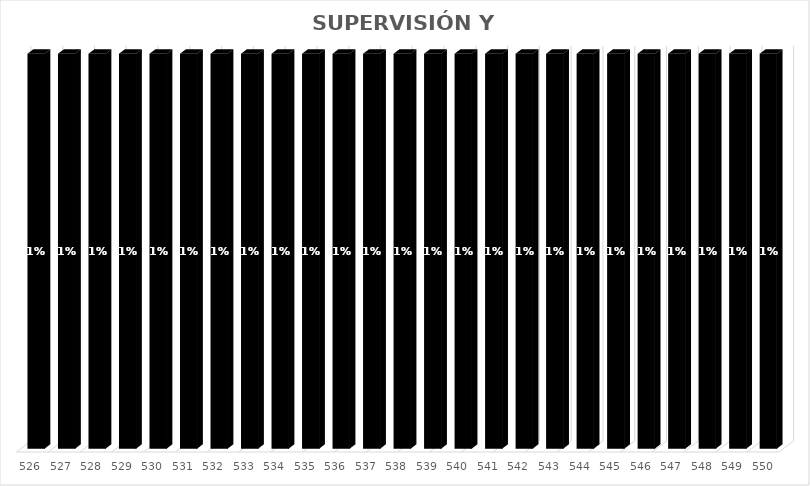
| Category | % Avance |
|---|---|
| 526.0 | 0.01 |
| 527.0 | 0.01 |
| 528.0 | 0.01 |
| 529.0 | 0.01 |
| 530.0 | 0.01 |
| 531.0 | 0.01 |
| 532.0 | 0.01 |
| 533.0 | 0.01 |
| 534.0 | 0.01 |
| 535.0 | 0.01 |
| 536.0 | 0.01 |
| 537.0 | 0.01 |
| 538.0 | 0.01 |
| 539.0 | 0.01 |
| 540.0 | 0.01 |
| 541.0 | 0.01 |
| 542.0 | 0.01 |
| 543.0 | 0.01 |
| 544.0 | 0.01 |
| 545.0 | 0.01 |
| 546.0 | 0.01 |
| 547.0 | 0.01 |
| 548.0 | 0.01 |
| 549.0 | 0.01 |
| 550.0 | 0.01 |